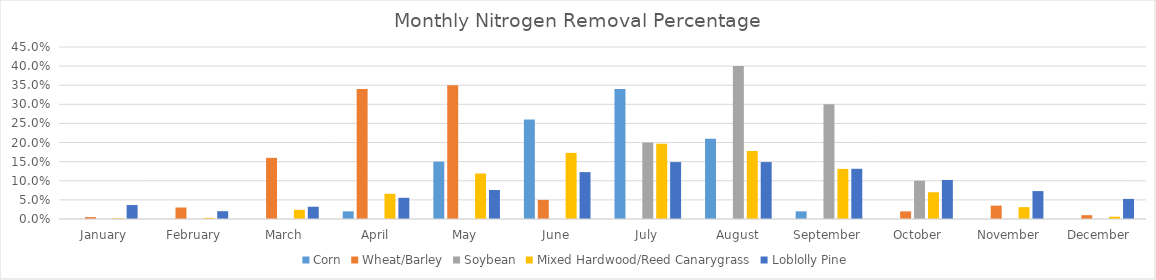
| Category | Corn | Wheat/Barley | Soybean | Mixed Hardwood/Reed Canarygrass | Loblolly Pine |
|---|---|---|---|---|---|
| January | 0 | 0.005 | 0 | 0.002 | 0.036 |
| February | 0 | 0.03 | 0 | 0.003 | 0.02 |
| March | 0 | 0.16 | 0 | 0.024 | 0.032 |
| April | 0.02 | 0.34 | 0 | 0.066 | 0.055 |
| May | 0.15 | 0.35 | 0 | 0.119 | 0.076 |
| June | 0.26 | 0.05 | 0 | 0.173 | 0.123 |
| July | 0.34 | 0 | 0.2 | 0.197 | 0.149 |
| August | 0.21 | 0 | 0.4 | 0.178 | 0.149 |
| September | 0.02 | 0 | 0.3 | 0.131 | 0.131 |
| October | 0 | 0.02 | 0.1 | 0.07 | 0.102 |
| November | 0 | 0.035 | 0 | 0.031 | 0.073 |
| December | 0 | 0.01 | 0 | 0.006 | 0.053 |